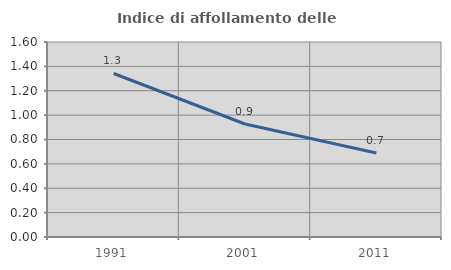
| Category | Indice di affollamento delle abitazioni  |
|---|---|
| 1991.0 | 1.342 |
| 2001.0 | 0.927 |
| 2011.0 | 0.689 |